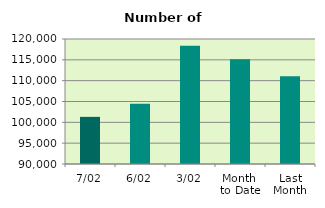
| Category | Series 0 |
|---|---|
| 7/02 | 101314 |
| 6/02 | 104464 |
| 3/02 | 118376 |
| Month 
to Date | 115123.6 |
| Last
Month | 111077.545 |